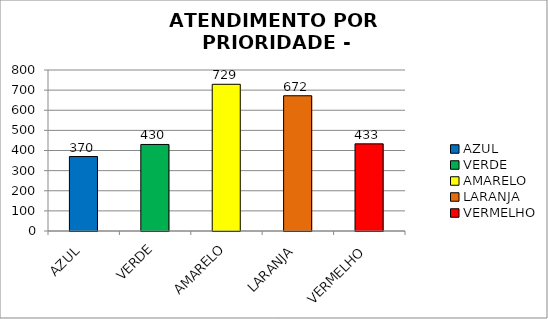
| Category | Total Regional: |
|---|---|
| AZUL | 370 |
| VERDE | 430 |
| AMARELO | 729 |
| LARANJA | 672 |
| VERMELHO | 433 |